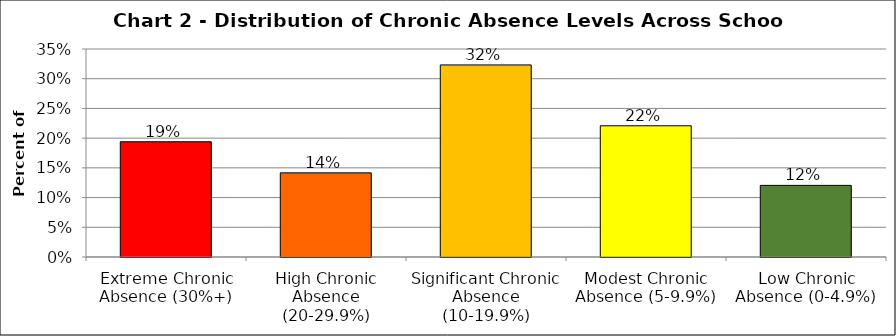
| Category | Series 1 |
|---|---|
| Extreme Chronic Absence (30%+) | 0.194 |
| High Chronic Absence (20-29.9%) | 0.142 |
| Significant Chronic Absence (10-19.9%) | 0.323 |
| Modest Chronic Absence (5-9.9%) | 0.221 |
| Low Chronic Absence (0-4.9%) | 0.121 |